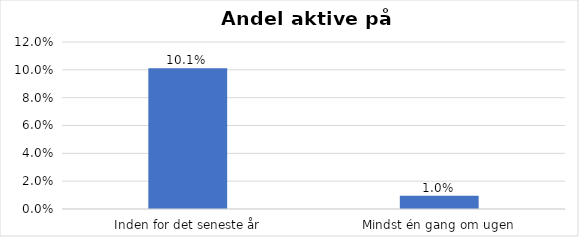
| Category | % |
|---|---|
| Inden for det seneste år | 0.101 |
| Mindst én gang om ugen | 0.01 |